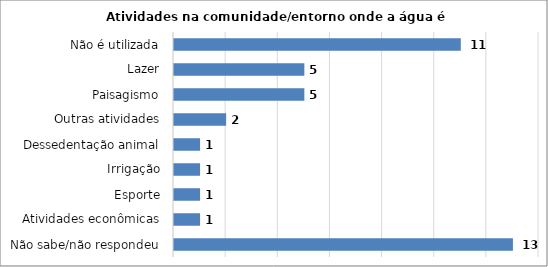
| Category | Series 0 |
|---|---|
| Não sabe/não respondeu | 13 |
| Atividades econômicas | 1 |
| Esporte | 1 |
| Irrigação | 1 |
| Dessedentação animal | 1 |
| Outras atividades | 2 |
| Paisagismo | 5 |
| Lazer | 5 |
| Não é utilizada | 11 |